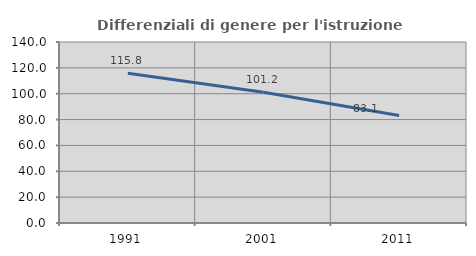
| Category | Differenziali di genere per l'istruzione superiore |
|---|---|
| 1991.0 | 115.789 |
| 2001.0 | 101.207 |
| 2011.0 | 83.077 |